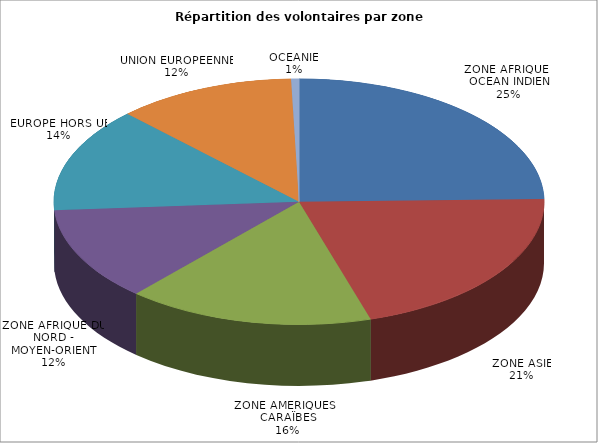
| Category | Nombre de volontaires | % |
|---|---|---|
| ZONE AFRIQUE - OCEAN INDIEN | 238 | 0.247 |
| ZONE ASIE | 199 | 0.206 |
| ZONE AMERIQUES - CARAÏBES | 157 | 0.163 |
| ZONE AFRIQUE DU NORD - MOYEN-ORIENT | 119 | 0.123 |
| EUROPE HORS UE | 133 | 0.138 |
| UNION EUROPEENNE | 114 | 0.118 |
| OCEANIE | 5 | 0.005 |